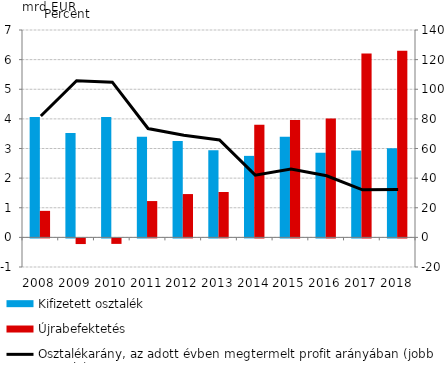
| Category | Kifizetett osztalék | Újrabefektetés |
|---|---|---|
| 2008.0 | 4.064 | 0.895 |
| 2009.0 | 3.522 | -0.192 |
| 2010.0 | 4.061 | -0.186 |
| 2011.0 | 3.399 | 1.226 |
| 2012.0 | 3.253 | 1.462 |
| 2013.0 | 2.938 | 1.531 |
| 2014.0 | 2.751 | 3.802 |
| 2015.0 | 3.396 | 3.962 |
| 2016.0 | 2.853 | 4.01 |
| 2017.0 | 2.933 | 6.204 |
| 2018.0 | 3.011 | 6.303 |